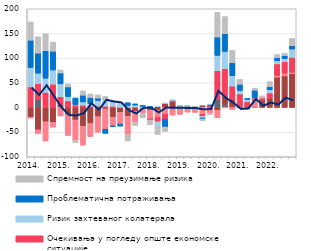
| Category | Други фактори | Трошкови извора за кредите | Конкуренција осталих банака | Очекивања у погледу опште економске ситуације | Ризик захтеваног колатерала | Проблематична потраживања | Спремност на преузимање ризика |
|---|---|---|---|---|---|---|---|
| 2014. | 0.8 | -19.9 | -1.7 | 41 | 39.1 | 55.5 | 36.9 |
|  | 16.1 | -45.3 | -7.7 | 31.9 | 21.4 | 40.8 | 33.2 |
|  | 0 | -29 | -39.1 | 30.4 | 28.9 | 55.7 | 34.4 |
|  | 0 | -30.3 | -9.6 | 47.3 | 28.6 | 38.1 | 18.7 |
| 2015. | 0 | 5.3 | -17.2 | 16.4 | 26.1 | 22.1 | 6.2 |
|  | 0 | -14.5 | -42.3 | 13.3 | 8.7 | 19.6 | 6 |
|  | -0.9 | -24.7 | -41.2 | 5.2 | 0.6 | 13.5 | -4.1 |
|  | 0.5 | -38.1 | -38.3 | 4.2 | 6.5 | 13.7 | 8.7 |
| 2016. | 0 | -32.5 | -26.6 | 2.8 | 4.8 | 12.6 | 7.3 |
|  | 0 | -18.6 | -31.7 | 2.8 | 11.4 | 4.8 | 6.6 |
|  | 0 | -3.2 | -40.9 | 2.6 | 11.7 | -8.5 | 8 |
|  | 0 | -19.7 | -17.5 | 2.6 | 6.4 | -2 | 5.6 |
| 2017. | 0 | -9.9 | -23.6 | 0.3 | 6.6 | -4.3 | 1.9 |
|  | 0 | -17.9 | -37.2 | 0.4 | 3.4 | 5.9 | -12.7 |
|  | 0 | -7.4 | -22.4 | 0.6 | 4.3 | 2.5 | -6.8 |
|  | 0 | -2.2 | -9.3 | 0.1 | 2.2 | 2.2 | -9.5 |
| 2018. | 0 | -5.5 | -17.5 | -2.5 | 0 | 1.9 | -9.6 |
|  | 0 | -5.2 | -14.4 | -9.5 | -9.1 | 0.3 | -16.5 |
|  | 0 | 8.2 | -13.3 | -10.8 | 0.3 | -15.6 | -8.9 |
|  | 0 | 13.5 | -15.5 | 0.1 | 0.3 | 0.3 | 0.1 |
| 2019. | 0 | 0 | -14 | 0.1 | 2.4 | 0.3 | 0.1 |
|  | 0 | 2.3 | -9.4 | 0.1 | 0.3 | 0.3 | 0.1 |
|  | 0 | 0 | -9.9 | 0.1 | 0.4 | 0.4 | 0.1 |
|  | 0 | 3.5 | -13.7 | -4.4 | -3.2 | -2.2 | -3.4 |
| 2020. | 0 | 0 | -11.883 | 3.724 | 0.378 | 0.378 | -2.584 |
|  | 16.612 | -5.65 | -15.101 | 57.663 | 31.218 | 37.319 | 50.006 |
|  | 6.741 | 15.928 | -0.146 | 55.94 | 34.956 | 36.078 | 34.536 |
|  | 0 | 16.17 | -3.996 | 27.215 | 21.105 | 26.435 | 24.908 |
| 2021. | 0 | 0 | -0.156 | 27.49 | 6.714 | 12.868 | 10.026 |
|  | 0 | 0 | -2.567 | 11.395 | 5.047 | 2.218 | -1.39 |
|  | 0.48 | 0 | 14.64 | 4.268 | 0.333 | 15.307 | 3.927 |
|  | 0 | 15.373 | 0 | 3.916 | 0 | 0 | 4.286 |
| 2022. | 0 | 19.171 | 0 | 10.207 | 6.373 | 6.373 | 10.207 |